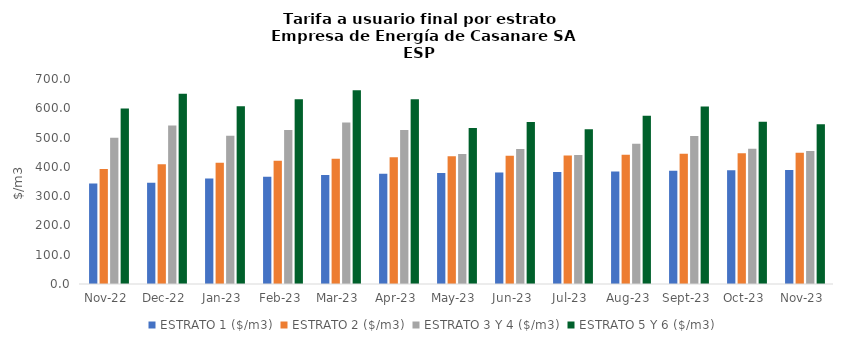
| Category | ESTRATO 1 ($/m3) | ESTRATO 2 ($/m3) | ESTRATO 3 Y 4 ($/m3) | ESTRATO 5 Y 6 ($/m3) |
|---|---|---|---|---|
| 2022-11-01 | 342.8 | 393 | 499.63 | 599.556 |
| 2022-12-01 | 345.44 | 408.5 | 541.57 | 649.884 |
| 2023-01-01 | 359.93 | 413.65 | 505.984 | 607.18 |
| 2023-02-01 | 366.33 | 421 | 525.703 | 630.843 |
| 2023-03-01 | 372.41 | 428 | 551.417 | 661.7 |
| 2023-04-01 | 376.32 | 432.49 | 525.703 | 630.843 |
| 2023-05-01 | 379.26 | 435.87 | 444.034 | 532.841 |
| 2023-06-01 | 380.92 | 437.78 | 460.92 | 553.104 |
| 2023-07-01 | 382.06 | 439.09 | 440.108 | 528.13 |
| 2023-08-01 | 383.97 | 441.29 | 479.093 | 574.912 |
| 2023-09-01 | 386.66 | 444.37 | 505.302 | 606.362 |
| 2023-10-01 | 388.72 | 446.74 | 461.695 | 554.034 |
| 2023-11-01 | 389.69 | 447.85 | 454.34 | 545.208 |